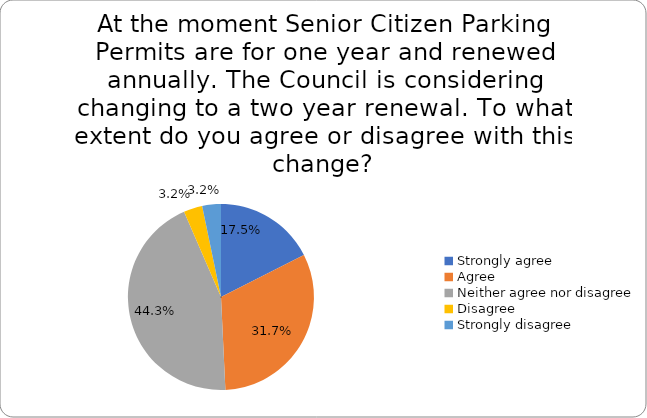
| Category | Series 0 |
|---|---|
| Strongly agree | 0.175 |
| Agree | 0.317 |
| Neither agree nor disagree | 0.443 |
| Disagree | 0.032 |
| Strongly disagree | 0.032 |